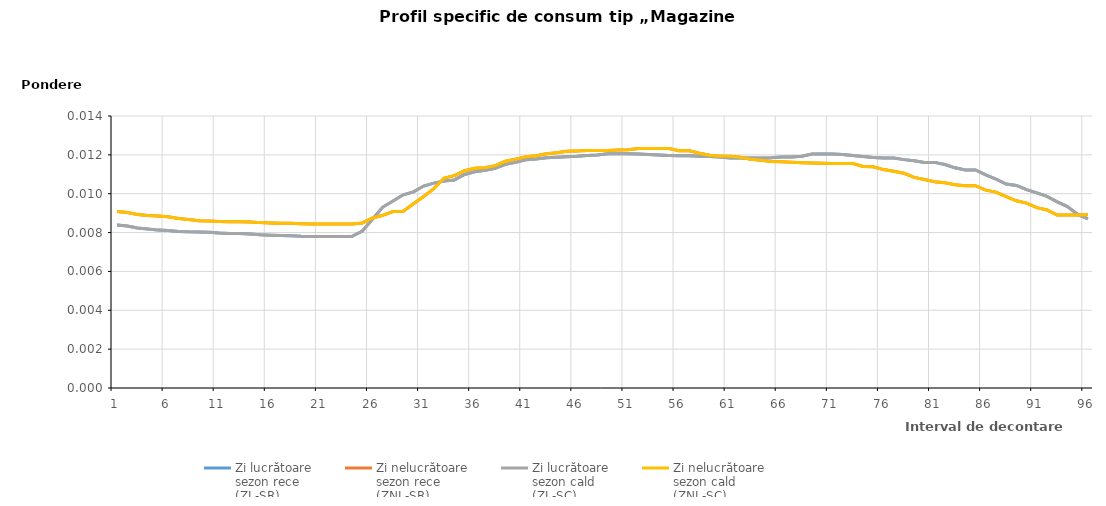
| Category | Zi lucrătoare 
sezon rece
(ZL-SR) | Zi nelucrătoare 
sezon rece
(ZNL-SR) | Zi lucrătoare 
sezon cald
(ZL-SC) | Zi nelucrătoare 
sezon cald
(ZNL-SC) |
|---|---|---|---|---|
| 1.0 | 0.008 | 0.009 | 0.008 | 0.009 |
| 2.0 | 0.008 | 0.009 | 0.008 | 0.009 |
| 3.0 | 0.008 | 0.009 | 0.008 | 0.009 |
| 4.0 | 0.008 | 0.009 | 0.008 | 0.009 |
| 5.0 | 0.008 | 0.009 | 0.008 | 0.009 |
| 6.0 | 0.008 | 0.009 | 0.008 | 0.009 |
| 7.0 | 0.008 | 0.009 | 0.008 | 0.009 |
| 8.0 | 0.008 | 0.009 | 0.008 | 0.009 |
| 9.0 | 0.008 | 0.009 | 0.008 | 0.009 |
| 10.0 | 0.008 | 0.009 | 0.008 | 0.009 |
| 11.0 | 0.008 | 0.009 | 0.008 | 0.009 |
| 12.0 | 0.008 | 0.009 | 0.008 | 0.009 |
| 13.0 | 0.008 | 0.009 | 0.008 | 0.009 |
| 14.0 | 0.008 | 0.009 | 0.008 | 0.009 |
| 15.0 | 0.008 | 0.009 | 0.008 | 0.009 |
| 16.0 | 0.008 | 0.008 | 0.008 | 0.008 |
| 17.0 | 0.008 | 0.008 | 0.008 | 0.008 |
| 18.0 | 0.008 | 0.008 | 0.008 | 0.008 |
| 19.0 | 0.008 | 0.008 | 0.008 | 0.008 |
| 20.0 | 0.008 | 0.008 | 0.008 | 0.008 |
| 21.0 | 0.008 | 0.008 | 0.008 | 0.008 |
| 22.0 | 0.008 | 0.008 | 0.008 | 0.008 |
| 23.0 | 0.008 | 0.008 | 0.008 | 0.008 |
| 24.0 | 0.008 | 0.008 | 0.008 | 0.008 |
| 25.0 | 0.008 | 0.008 | 0.008 | 0.008 |
| 26.0 | 0.009 | 0.009 | 0.009 | 0.009 |
| 27.0 | 0.009 | 0.009 | 0.009 | 0.009 |
| 28.0 | 0.01 | 0.009 | 0.01 | 0.009 |
| 29.0 | 0.01 | 0.009 | 0.01 | 0.009 |
| 30.0 | 0.01 | 0.009 | 0.01 | 0.009 |
| 31.0 | 0.01 | 0.01 | 0.01 | 0.01 |
| 32.0 | 0.011 | 0.01 | 0.011 | 0.01 |
| 33.0 | 0.011 | 0.011 | 0.011 | 0.011 |
| 34.0 | 0.011 | 0.011 | 0.011 | 0.011 |
| 35.0 | 0.011 | 0.011 | 0.011 | 0.011 |
| 36.0 | 0.011 | 0.011 | 0.011 | 0.011 |
| 37.0 | 0.011 | 0.011 | 0.011 | 0.011 |
| 38.0 | 0.011 | 0.011 | 0.011 | 0.011 |
| 39.0 | 0.012 | 0.012 | 0.012 | 0.012 |
| 40.0 | 0.012 | 0.012 | 0.012 | 0.012 |
| 41.0 | 0.012 | 0.012 | 0.012 | 0.012 |
| 42.0 | 0.012 | 0.012 | 0.012 | 0.012 |
| 43.0 | 0.012 | 0.012 | 0.012 | 0.012 |
| 44.0 | 0.012 | 0.012 | 0.012 | 0.012 |
| 45.0 | 0.012 | 0.012 | 0.012 | 0.012 |
| 46.0 | 0.012 | 0.012 | 0.012 | 0.012 |
| 47.0 | 0.012 | 0.012 | 0.012 | 0.012 |
| 48.0 | 0.012 | 0.012 | 0.012 | 0.012 |
| 49.0 | 0.012 | 0.012 | 0.012 | 0.012 |
| 50.0 | 0.012 | 0.012 | 0.012 | 0.012 |
| 51.0 | 0.012 | 0.012 | 0.012 | 0.012 |
| 52.0 | 0.012 | 0.012 | 0.012 | 0.012 |
| 53.0 | 0.012 | 0.012 | 0.012 | 0.012 |
| 54.0 | 0.012 | 0.012 | 0.012 | 0.012 |
| 55.0 | 0.012 | 0.012 | 0.012 | 0.012 |
| 56.0 | 0.012 | 0.012 | 0.012 | 0.012 |
| 57.0 | 0.012 | 0.012 | 0.012 | 0.012 |
| 58.0 | 0.012 | 0.012 | 0.012 | 0.012 |
| 59.0 | 0.012 | 0.012 | 0.012 | 0.012 |
| 60.0 | 0.012 | 0.012 | 0.012 | 0.012 |
| 61.0 | 0.012 | 0.012 | 0.012 | 0.012 |
| 62.0 | 0.012 | 0.012 | 0.012 | 0.012 |
| 63.0 | 0.012 | 0.012 | 0.012 | 0.012 |
| 64.0 | 0.012 | 0.012 | 0.012 | 0.012 |
| 65.0 | 0.012 | 0.012 | 0.012 | 0.012 |
| 66.0 | 0.012 | 0.012 | 0.012 | 0.012 |
| 67.0 | 0.012 | 0.012 | 0.012 | 0.012 |
| 68.0 | 0.012 | 0.012 | 0.012 | 0.012 |
| 69.0 | 0.012 | 0.012 | 0.012 | 0.012 |
| 70.0 | 0.012 | 0.012 | 0.012 | 0.012 |
| 71.0 | 0.012 | 0.012 | 0.012 | 0.012 |
| 72.0 | 0.012 | 0.012 | 0.012 | 0.012 |
| 73.0 | 0.012 | 0.012 | 0.012 | 0.012 |
| 74.0 | 0.012 | 0.011 | 0.012 | 0.011 |
| 75.0 | 0.012 | 0.011 | 0.012 | 0.011 |
| 76.0 | 0.012 | 0.011 | 0.012 | 0.011 |
| 77.0 | 0.012 | 0.011 | 0.012 | 0.011 |
| 78.0 | 0.012 | 0.011 | 0.012 | 0.011 |
| 79.0 | 0.012 | 0.011 | 0.012 | 0.011 |
| 80.0 | 0.012 | 0.011 | 0.012 | 0.011 |
| 81.0 | 0.012 | 0.011 | 0.012 | 0.011 |
| 82.0 | 0.012 | 0.011 | 0.012 | 0.011 |
| 83.0 | 0.011 | 0.01 | 0.011 | 0.01 |
| 84.0 | 0.011 | 0.01 | 0.011 | 0.01 |
| 85.0 | 0.011 | 0.01 | 0.011 | 0.01 |
| 86.0 | 0.011 | 0.01 | 0.011 | 0.01 |
| 87.0 | 0.011 | 0.01 | 0.011 | 0.01 |
| 88.0 | 0.01 | 0.01 | 0.01 | 0.01 |
| 89.0 | 0.01 | 0.01 | 0.01 | 0.01 |
| 90.0 | 0.01 | 0.01 | 0.01 | 0.01 |
| 91.0 | 0.01 | 0.009 | 0.01 | 0.009 |
| 92.0 | 0.01 | 0.009 | 0.01 | 0.009 |
| 93.0 | 0.01 | 0.009 | 0.01 | 0.009 |
| 94.0 | 0.009 | 0.009 | 0.009 | 0.009 |
| 95.0 | 0.009 | 0.009 | 0.009 | 0.009 |
| 96.0 | 0.009 | 0.009 | 0.009 | 0.009 |